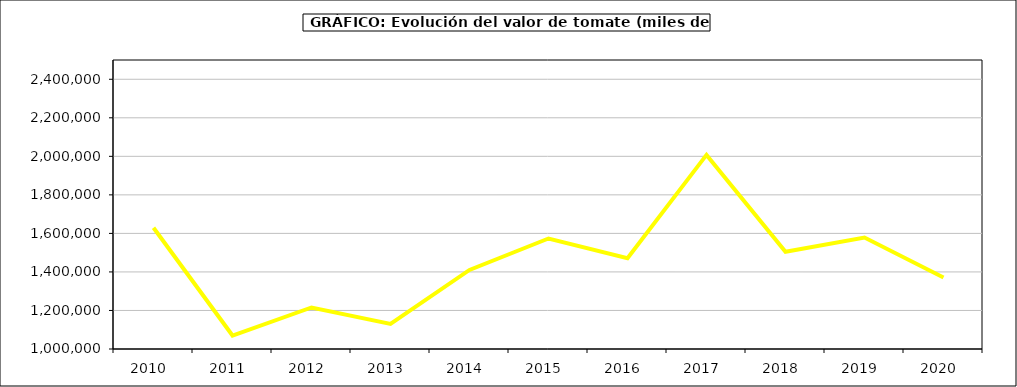
| Category | Valor |
|---|---|
| 2010.0 | 1629341.46 |
| 2011.0 | 1069974.828 |
| 2012.0 | 1215542.465 |
| 2013.0 | 1130344.662 |
| 2014.0 | 1410496.854 |
| 2015.0 | 1573527 |
| 2016.0 | 1471672 |
| 2017.0 | 2007555.581 |
| 2018.0 | 1504491.723 |
| 2019.0 | 1578676.476 |
| 2020.0 | 1371069.32 |